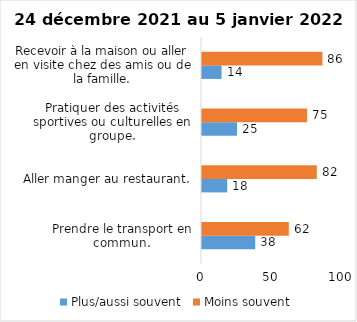
| Category | Plus/aussi souvent | Moins souvent |
|---|---|---|
| Prendre le transport en commun. | 38 | 62 |
| Aller manger au restaurant. | 18 | 82 |
| Pratiquer des activités sportives ou culturelles en groupe. | 25 | 75 |
| Recevoir à la maison ou aller en visite chez des amis ou de la famille. | 14 | 86 |